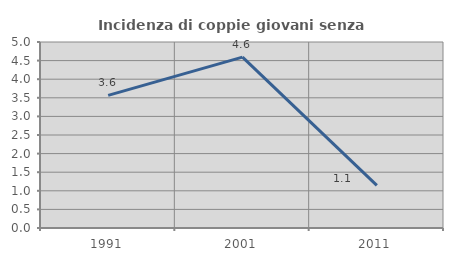
| Category | Incidenza di coppie giovani senza figli |
|---|---|
| 1991.0 | 3.565 |
| 2001.0 | 4.593 |
| 2011.0 | 1.147 |